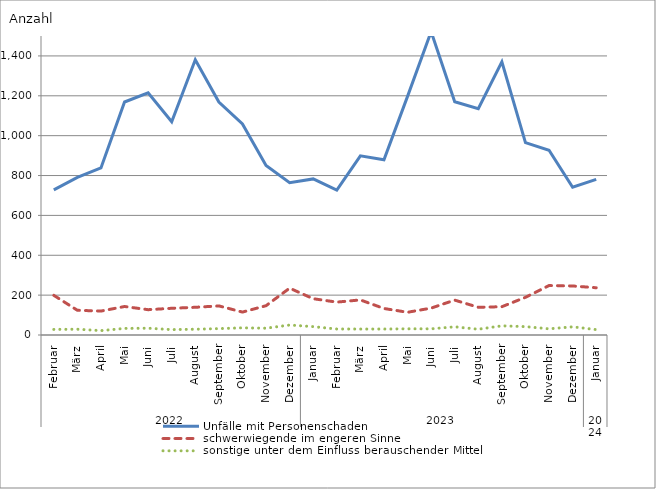
| Category | Unfälle mit Personenschaden | schwerwiegende im engeren Sinne | sonstige unter dem Einfluss berauschender Mittel |
|---|---|---|---|
| 0 | 728 | 199 | 28 |
| 1 | 791 | 124 | 29 |
| 2 | 838 | 120 | 22 |
| 3 | 1169 | 143 | 33 |
| 4 | 1215 | 127 | 34 |
| 5 | 1070 | 134 | 27 |
| 6 | 1381 | 139 | 29 |
| 7 | 1169 | 146 | 32 |
| 8 | 1059 | 115 | 36 |
| 9 | 850 | 147 | 34 |
| 10 | 764 | 235 | 50 |
| 11 | 783 | 182 | 42 |
| 12 | 727 | 165 | 30 |
| 13 | 899 | 176 | 30 |
| 14 | 879 | 133 | 30 |
| 15 | 1197 | 114 | 31 |
| 16 | 1522 | 135 | 31 |
| 17 | 1170 | 175 | 41 |
| 18 | 1135 | 139 | 29 |
| 19 | 1371 | 142 | 46 |
| 20 | 965 | 189 | 42 |
| 21 | 927 | 248 | 31 |
| 22 | 741 | 246 | 41 |
| 23 | 781 | 237 | 27 |